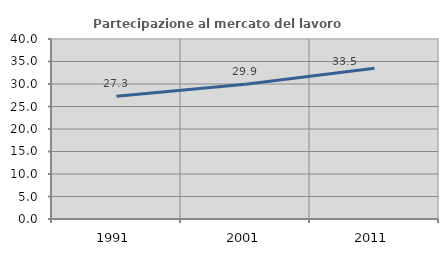
| Category | Partecipazione al mercato del lavoro  femminile |
|---|---|
| 1991.0 | 27.26 |
| 2001.0 | 29.927 |
| 2011.0 | 33.485 |